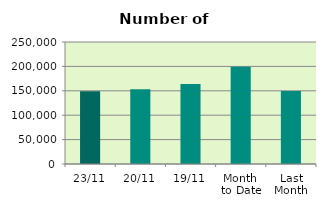
| Category | Series 0 |
|---|---|
| 23/11 | 149092 |
| 20/11 | 153012 |
| 19/11 | 163748 |
| Month 
to Date | 199513.875 |
| Last
Month | 149554.818 |